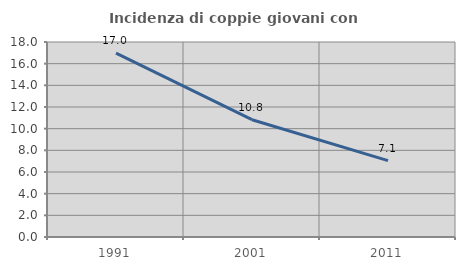
| Category | Incidenza di coppie giovani con figli |
|---|---|
| 1991.0 | 16.981 |
| 2001.0 | 10.828 |
| 2011.0 | 7.051 |